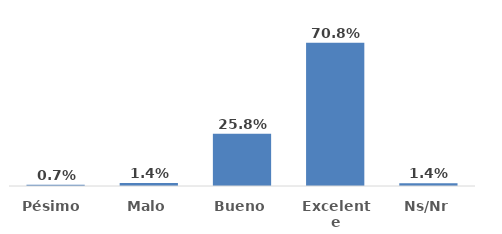
| Category | Series 0 |
|---|---|
| Pésimo  | 0.007 |
| Malo | 0.014 |
| Bueno | 0.258 |
| Excelente | 0.708 |
| Ns/Nr | 0.014 |